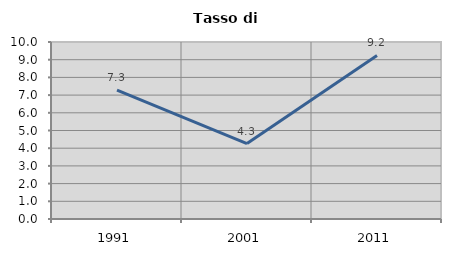
| Category | Tasso di disoccupazione   |
|---|---|
| 1991.0 | 7.278 |
| 2001.0 | 4.262 |
| 2011.0 | 9.244 |